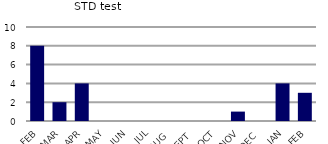
| Category | STD test |
|---|---|
| FEB | 8 |
| MAR | 2 |
| APR | 4 |
| MAY | 0 |
| JUN | 0 |
| JUL | 0 |
| AUG | 0 |
| SEPT | 0 |
| OCT | 0 |
| NOV | 1 |
| DEC | 0 |
| JAN | 4 |
| FEB | 3 |